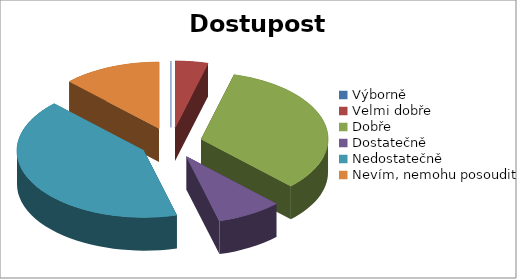
| Category | Dostupost maloobchodů |
|---|---|
| Výborně | 0 |
| Velmi dobře | 1 |
| Dobře | 8 |
| Dostatečně | 2 |
| Nedostatečně | 10 |
| Nevím, nemohu posoudit | 3 |